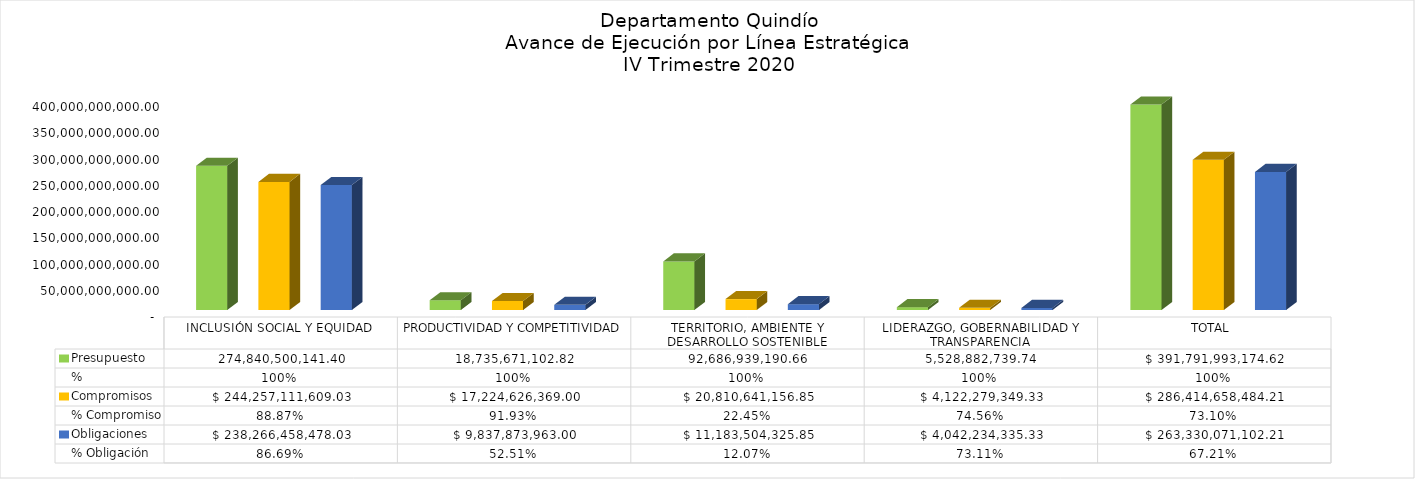
| Category | Presupuesto | %  | Compromisos | % Compromiso | Obligaciones | % Obligación |
|---|---|---|---|---|---|---|
| INCLUSIÓN SOCIAL Y EQUIDAD | 274840500141.4 | 1 | 244257111609.033 | 0.889 | 238266458478.033 | 0.867 |
| PRODUCTIVIDAD Y COMPETITIVIDAD | 18735671102.82 | 1 | 17224626369 | 0.919 | 9837873963 | 0.525 |
| TERRITORIO, AMBIENTE Y DESARROLLO SOSTENIBLE | 92686939190.66 | 1 | 20810641156.85 | 0.225 | 11183504325.85 | 0.121 |
| LIDERAZGO, GOBERNABILIDAD Y TRANSPARENCIA | 5528882739.74 | 1 | 4122279349.33 | 0.746 | 4042234335.33 | 0.731 |
| TOTAL  | 391791993174.62 | 1 | 286414658484.213 | 0.731 | 263330071102.213 | 0.672 |